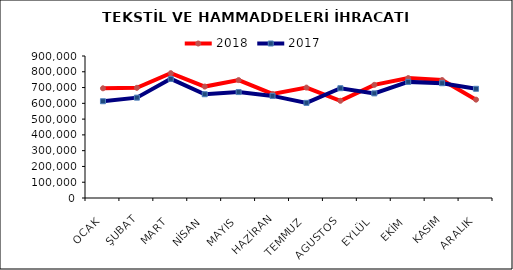
| Category | 2018 | 2017 |
|---|---|---|
| OCAK | 695250.152 | 613304.717 |
| ŞUBAT | 698403.159 | 636040.205 |
| MART | 791182.516 | 755210.13 |
| NİSAN | 706286.527 | 657577.778 |
| MAYIS | 747262.96 | 671398.492 |
| HAZİRAN | 659459.941 | 647070.766 |
| TEMMUZ | 699662.711 | 602878.176 |
| AGUSTOS | 616081.447 | 695782.398 |
| EYLÜL | 717101.179 | 663202.047 |
| EKİM | 760085.947 | 735935.231 |
| KASIM | 747408.99 | 727390.026 |
| ARALIK | 623297.84 | 692201.033 |